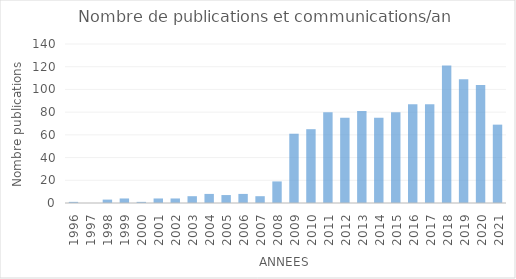
| Category | Series 0 |
|---|---|
| 1996.0 | 1 |
| 1997.0 | 0 |
| 1998.0 | 3 |
| 1999.0 | 4 |
| 2000.0 | 1 |
| 2001.0 | 4 |
| 2002.0 | 4 |
| 2003.0 | 6 |
| 2004.0 | 8 |
| 2005.0 | 7 |
| 2006.0 | 8 |
| 2007.0 | 6 |
| 2008.0 | 19 |
| 2009.0 | 61 |
| 2010.0 | 65 |
| 2011.0 | 80 |
| 2012.0 | 75 |
| 2013.0 | 81 |
| 2014.0 | 75 |
| 2015.0 | 80 |
| 2016.0 | 87 |
| 2017.0 | 87 |
| 2018.0 | 121 |
| 2019.0 | 109 |
| 2020.0 | 104 |
| 2021.0 | 69 |